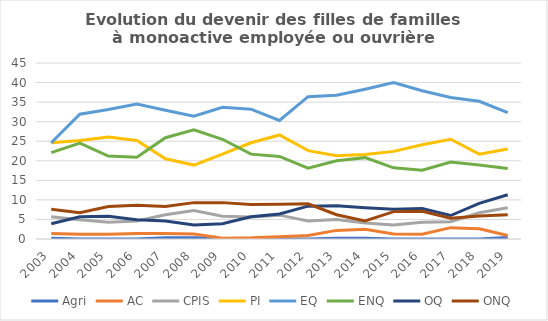
| Category | Agri | AC | CPIS | PI | EQ | ENQ | OQ | ONQ |
|---|---|---|---|---|---|---|---|---|
| 2003.0 | 0.2 | 1.4 | 5.7 | 24.6 | 24.6 | 22.1 | 3.9 | 7.6 |
| 2004.0 | 0 | 1.2 | 4.9 | 25.2 | 31.9 | 24.5 | 5.7 | 6.7 |
| 2005.0 | 0 | 1.2 | 4.3 | 26.1 | 33.1 | 21.2 | 5.8 | 8.3 |
| 2006.0 | 0 | 1.4 | 4.6 | 25.2 | 34.5 | 20.9 | 4.9 | 8.6 |
| 2007.0 | 0.3 | 1.4 | 6.2 | 20.5 | 32.9 | 25.9 | 4.6 | 8.3 |
| 2008.0 | 0.3 | 1.3 | 7.3 | 18.9 | 31.4 | 27.9 | 3.6 | 9.3 |
| 2009.0 | 0.1 | 0.2 | 5.8 | 21.7 | 33.7 | 25.5 | 3.9 | 9.3 |
| 2010.0 | 0.1 | 0.3 | 5.6 | 24.6 | 33.2 | 21.7 | 5.7 | 8.8 |
| 2011.0 | 0 | 0.6 | 6.1 | 26.6 | 30.3 | 21.1 | 6.4 | 8.9 |
| 2012.0 | 0 | 0.9 | 4.6 | 22.6 | 36.4 | 18.1 | 8.4 | 9 |
| 2013.0 | 0.2 | 2.2 | 5 | 21.3 | 36.74 | 20 | 8.5 | 6.2 |
| 2014.0 | 0.2 | 2.5 | 4.1 | 21.6 | 38.3 | 20.8 | 8 | 4.6 |
| 2015.0 | 0 | 1.3 | 3.6 | 22.4 | 40 | 18.2 | 7.6 | 7 |
| 2016.0 | 0 | 1.2 | 4.3 | 24.1 | 37.9 | 17.6 | 7.8 | 7.1 |
| 2017.0 | 0 | 2.9 | 4.4 | 25.5 | 36.2 | 19.7 | 6 | 5.3 |
| 2018.0 | 0 | 2.6 | 6.7 | 21.7 | 35.2 | 18.9 | 9.1 | 5.9 |
| 2019.0 | 0.4 | 0.9 | 8 | 23 | 32.3 | 18 | 11.3 | 6.2 |